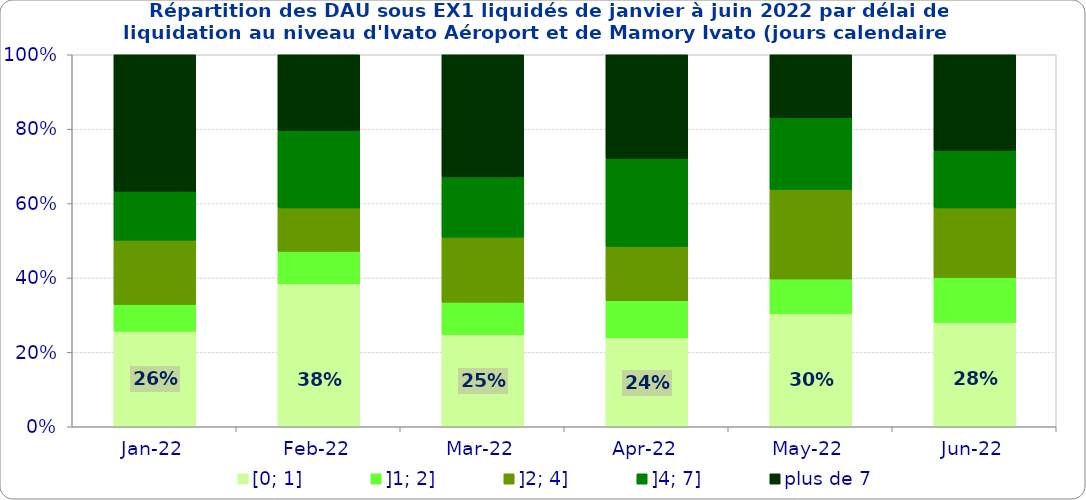
| Category | [0; 1] | ]1; 2] | ]2; 4] | ]4; 7] | plus de 7 |
|---|---|---|---|---|---|
| 2022-01-01 | 0.257 | 0.072 | 0.173 | 0.132 | 0.367 |
| 2022-02-01 | 0.385 | 0.087 | 0.117 | 0.208 | 0.203 |
| 2022-03-01 | 0.247 | 0.087 | 0.175 | 0.162 | 0.328 |
| 2022-04-01 | 0.239 | 0.1 | 0.146 | 0.237 | 0.279 |
| 2022-05-01 | 0.303 | 0.094 | 0.24 | 0.193 | 0.169 |
| 2022-06-01 | 0.281 | 0.121 | 0.187 | 0.155 | 0.257 |